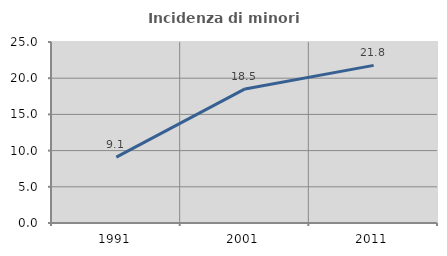
| Category | Incidenza di minori stranieri |
|---|---|
| 1991.0 | 9.091 |
| 2001.0 | 18.519 |
| 2011.0 | 21.774 |